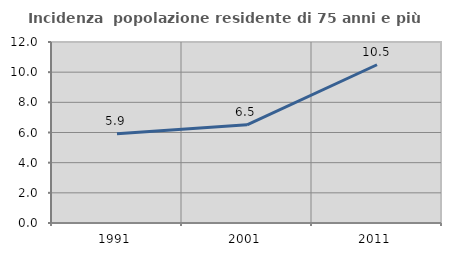
| Category | Incidenza  popolazione residente di 75 anni e più |
|---|---|
| 1991.0 | 5.911 |
| 2001.0 | 6.512 |
| 2011.0 | 10.491 |